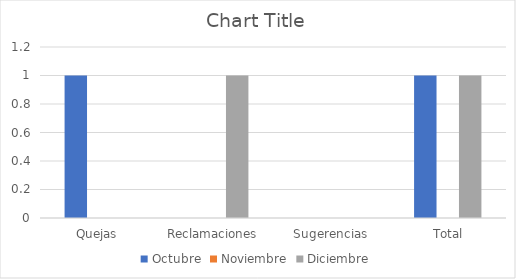
| Category | Octubre | Noviembre | Diciembre |
|---|---|---|---|
| Quejas | 1 | 0 | 0 |
| Reclamaciones | 0 | 0 | 1 |
| Sugerencias | 0 | 0 | 0 |
|  Total | 1 | 0 | 1 |